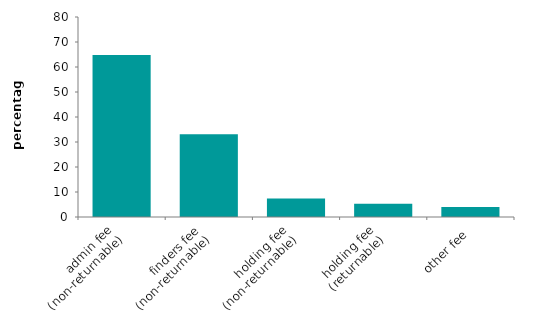
| Category | Series 0 |
|---|---|
| admin fee
(non-returnable) | 64.845 |
| finders fee
(non-returnable) | 33.06 |
| holding fee
(non-returnable) | 7.428 |
| holding fee
(returnable) | 5.264 |
| other fee | 4.023 |